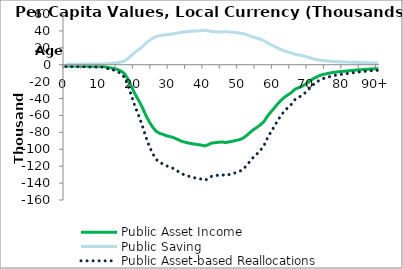
| Category | Public Asset Income | Public Saving | Public Asset-based Reallocations |
|---|---|---|---|
| 0 | -1496.928 | 634.788 | -2131.715 |
|  | -1575.311 | 668.027 | -2243.337 |
| 2 | -1623.576 | 688.494 | -2312.07 |
| 3 | -1636.559 | 694 | -2330.559 |
| 4 | -1644.312 | 697.287 | -2341.599 |
| 5 | -1691.949 | 717.488 | -2409.438 |
| 6 | -1762.567 | 747.435 | -2510.002 |
| 7 | -1876.316 | 795.671 | -2671.988 |
| 8 | -1922.887 | 815.42 | -2738.307 |
| 9 | -1915.917 | 812.464 | -2728.381 |
| 10 | -1944.545 | 824.604 | -2769.15 |
| 11 | -2019.638 | 856.448 | -2876.087 |
| 12 | -3133.324 | 1328.718 | -4462.043 |
| 13 | -3790.962 | 1607.596 | -5398.558 |
| 14 | -4597.751 | 1949.723 | -6547.474 |
| 15 | -5765.097 | 2444.749 | -8209.845 |
| 16 | -7653.585 | 3245.581 | -10899.166 |
| 17 | -10802.44 | 4580.886 | -15383.326 |
| 18 | -17723.021 | 7515.629 | -25238.65 |
| 19 | -26428.56 | 11207.302 | -37635.862 |
| 20 | -34961.167 | 14825.643 | -49786.81 |
| 21 | -42169.015 | 17882.205 | -60051.22 |
| 22 | -49973.952 | 21191.968 | -71165.921 |
| 23 | -59328.346 | 25158.795 | -84487.141 |
| 24 | -67225.908 | 28507.838 | -95733.746 |
| 25 | -73611.882 | 31215.875 | -104827.757 |
| 26 | -78517.484 | 33296.146 | -111813.63 |
| 27 | -81090.116 | 34387.098 | -115477.213 |
| 28 | -82363.37 | 34927.034 | -117290.404 |
| 29 | -83993.424 | 35618.275 | -119611.7 |
| 30 | -85016.95 | 36052.312 | -121069.262 |
| 31 | -86159.038 | 36536.626 | -122695.665 |
| 32 | -87942.754 | 37293.029 | -125235.783 |
| 33 | -89871.852 | 38111.083 | -127982.935 |
| 34 | -91314.555 | 38722.876 | -130037.431 |
| 35 | -92256.756 | 39122.426 | -131379.183 |
| 36 | -93165.302 | 39507.705 | -132673.007 |
| 37 | -93871.359 | 39807.115 | -133678.475 |
| 38 | -94441.074 | 40048.709 | -134489.783 |
| 39 | -94945.611 | 40262.663 | -135208.274 |
| 40 | -96001.792 | 40710.547 | -136712.339 |
| 41 | -94714.139 | 40164.505 | -134878.644 |
| 42 | -92659.049 | 39293.022 | -131952.071 |
| 43 | -92224.349 | 39108.684 | -131333.032 |
| 44 | -91708.391 | 38889.887 | -130598.278 |
| 45 | -91371.507 | 38747.027 | -130118.534 |
| 46 | -92150.18 | 39077.231 | -131227.411 |
| 47 | -91271.152 | 38704.471 | -129975.622 |
| 48 | -90556.842 | 38401.56 | -128958.403 |
| 49 | -89586.698 | 37990.161 | -127576.859 |
| 50 | -88632.386 | 37585.475 | -126217.861 |
| 51 | -87030.85 | 36906.327 | -123937.176 |
| 52 | -83998.65 | 35620.491 | -119619.141 |
| 53 | -80468.17 | 34123.355 | -114591.526 |
| 54 | -76960.549 | 32635.912 | -109596.462 |
| 55 | -74242.455 | 31483.277 | -105725.732 |
| 56 | -71214.61 | 30199.288 | -101413.898 |
| 57 | -67623.271 | 28676.344 | -96299.615 |
| 58 | -61428.34 | 26049.319 | -87477.659 |
| 59 | -56221.544 | 23841.324 | -80062.867 |
| 60 | -51569.891 | 21868.743 | -73438.634 |
| 61 | -46514.27 | 19724.854 | -66239.124 |
| 62 | -42088.382 | 17848.011 | -59936.394 |
| 63 | -38373.266 | 16272.578 | -54645.844 |
| 64 | -35561.768 | 15080.333 | -50642.102 |
| 65 | -32848.887 | 13929.909 | -46778.796 |
| 66 | -29015.672 | 12304.394 | -41320.067 |
| 67 | -27263.926 | 11561.548 | -38825.474 |
| 68 | -25583.758 | 10849.055 | -36432.813 |
| 69 | -23184.709 | 9831.714 | -33016.423 |
| 70 | -20370.658 | 8638.387 | -29009.045 |
| 71 | -17128.2 | 7263.389 | -24391.59 |
| 72 | -15068.889 | 6390.117 | -21459.006 |
| 73 | -12918.379 | 5478.171 | -18396.55 |
| 74 | -11612.149 | 4924.251 | -16536.4 |
| 75 | -10750.333 | 4558.789 | -15309.122 |
| 76 | -9925.325 | 4208.936 | -14134.261 |
| 77 | -9118.451 | 3866.773 | -12985.224 |
| 78 | -8623.626 | 3656.937 | -12280.563 |
| 79 | -8123.61 | 3444.9 | -11568.51 |
| 80 | -7746.761 | 3285.094 | -11031.854 |
| 81 | -7371.938 | 3126.146 | -10498.084 |
| 82 | -6963.507 | 2952.947 | -9916.454 |
| 83 | -6584.258 | 2792.122 | -9376.38 |
| 84 | -6211.818 | 2634.185 | -8846.003 |
| 85 | -5841.462 | 2477.132 | -8318.594 |
| 86 | -5548.778 | 2353.016 | -7901.794 |
| 87 | -5267.47 | 2233.725 | -7501.195 |
| 88 | -4963.483 | 2104.816 | -7068.299 |
| 89 | -4753.605 | 2015.815 | -6769.42 |
| 90+ | -4658.04 | 1975.29 | -6633.33 |